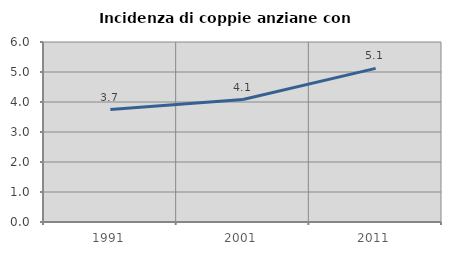
| Category | Incidenza di coppie anziane con figli |
|---|---|
| 1991.0 | 3.748 |
| 2001.0 | 4.082 |
| 2011.0 | 5.121 |